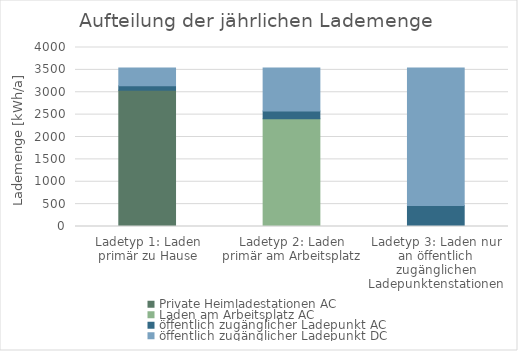
| Category | Private Heimladestationen AC | Laden am Arbeitsplatz AC | öffentlich zugänglicher Ladepunkt AC | öffentlich zugänglicher Ladepunkt DC |
|---|---|---|---|---|
| Ladetyp 1: Laden primär zu Hause | 3044.4 | 0 | 99.12 | 396.48 |
| Ladetyp 2: Laden primär am Arbeitsplatz | 0 | 2407.2 | 173.46 | 959.34 |
| Ladetyp 3: Laden nur an öffentlich zugänglichen Ladepunktenstationen | 0 | 0 | 470.82 | 3069.18 |